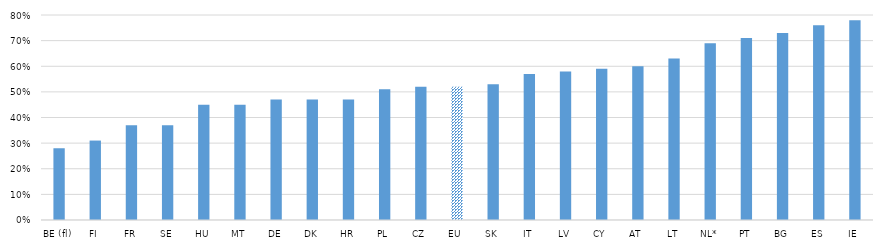
| Category | Percent of students  |
|---|---|
| BE (fl) | 0.28 |
| FI | 0.31 |
| FR | 0.37 |
| SE | 0.37 |
| HU | 0.45 |
| MT | 0.45 |
| DE | 0.47 |
| DK | 0.47 |
| HR | 0.47 |
| PL | 0.51 |
| CZ | 0.52 |
| EU | 0.52 |
| SK | 0.53 |
| IT | 0.57 |
| LV | 0.58 |
| CY | 0.59 |
| AT | 0.6 |
| LT | 0.63 |
| NL* | 0.69 |
| PT | 0.71 |
| BG | 0.73 |
| ES | 0.76 |
| IE | 0.78 |